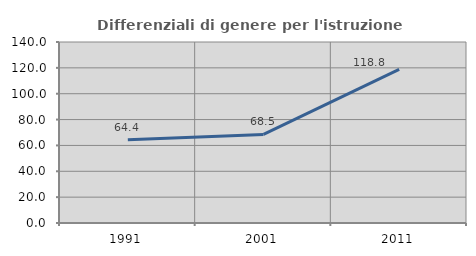
| Category | Differenziali di genere per l'istruzione superiore |
|---|---|
| 1991.0 | 64.36 |
| 2001.0 | 68.519 |
| 2011.0 | 118.799 |